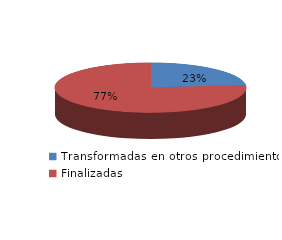
| Category | Series 0 |
|---|---|
| Transformadas en otros procedimientos | 1990 |
| Finalizadas | 6543 |